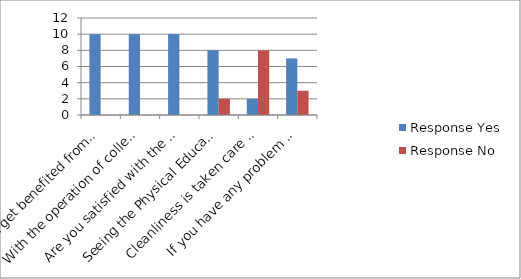
| Category | Response |
|---|---|
| Do you get benefited from college operations here? | 0 |
| With the operation of colleges, there is a huge appreciation for the Education of children. | 0 |
| Are you satisfied with the work done by the college for the Society? | 0 |
| Seeing the Physical Education courses run by the college,  will the Children around you the trend towards sports has increased | 2 |
| Cleanliness is taken care of in and around the campus by the College.  | 8 |
| If you have any problem with any program organized by the College from time to time. | 3 |